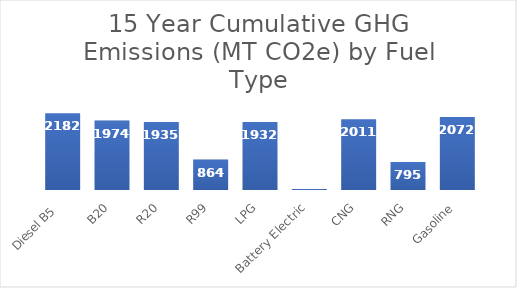
| Category | Series 0 |
|---|---|
| Diesel B5  | 2182.12 |
| B20 | 1974.084 |
| R20 | 1934.889 |
| R99 | 863.803 |
| LPG | 1932.338 |
| Battery Electric | 28.479 |
| CNG | 2010.897 |
| RNG | 794.628 |
| Gasoline | 2071.58 |